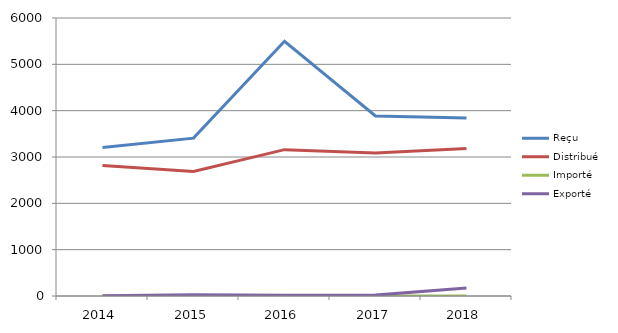
| Category | Reçu | Distribué | Importé | Exporté |
|---|---|---|---|---|
| 2014.0 | 3203 | 2818 | 0 | 7 |
| 2015.0 | 3407 | 2687 | 0 | 25 |
| 2016.0 | 5498 | 3159 | 0 | 17 |
| 2017.0 | 3887 | 3088 | 0 | 19 |
| 2018.0 | 3841 | 3182 | 0 | 172 |